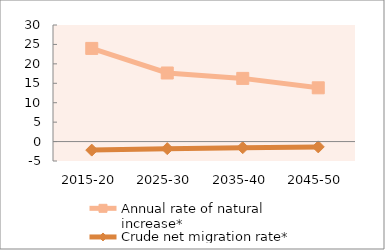
| Category | Annual rate of natural increase* | Crude net migration rate* |
|---|---|---|
| 2015-20 | 23.974 | -2.196 |
| 2025-30 | 17.651 | -1.823 |
| 2035-40 | 16.259 | -1.569 |
| 2045-50 | 13.836 | -1.366 |